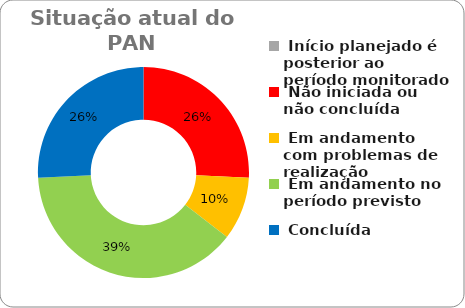
| Category | Series 0 |
|---|---|
|  Início planejado é posterior ao período monitorado | 0 |
|  Não iniciada ou não concluída | 0.258 |
|  Em andamento com problemas de realização | 0.097 |
|  Em andamento no período previsto  | 0.387 |
|  Concluída | 0.258 |